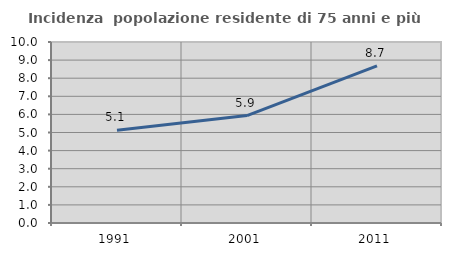
| Category | Incidenza  popolazione residente di 75 anni e più |
|---|---|
| 1991.0 | 5.125 |
| 2001.0 | 5.936 |
| 2011.0 | 8.684 |